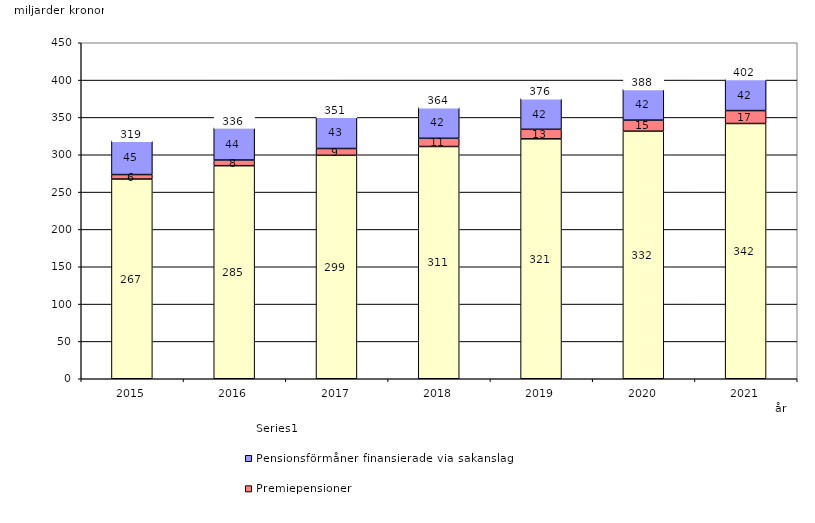
| Category | Inkomstpension och tilläggspension m.m. | Premiepensioner | Pensionsförmåner finansierade via sakanslag | Series 0 |
|---|---|---|---|---|
| 2015.0 | 267.466 | 6.008 | 45.361 | 20 |
| 2016.0 | 285.357 | 7.598 | 43.541 | 20 |
| 2017.0 | 299.269 | 9.082 | 42.554 | 20 |
| 2018.0 | 311.029 | 11.017 | 41.733 | 20 |
| 2019.0 | 321.332 | 12.774 | 41.596 | 20 |
| 2020.0 | 331.543 | 14.85 | 41.803 | 20 |
| 2021.0 | 341.865 | 17.304 | 42.353 | 20 |